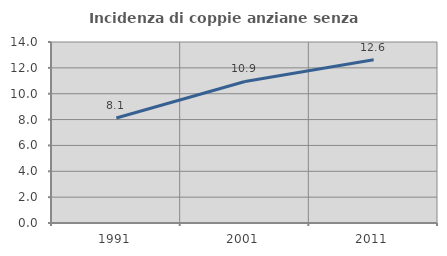
| Category | Incidenza di coppie anziane senza figli  |
|---|---|
| 1991.0 | 8.117 |
| 2001.0 | 10.95 |
| 2011.0 | 12.619 |